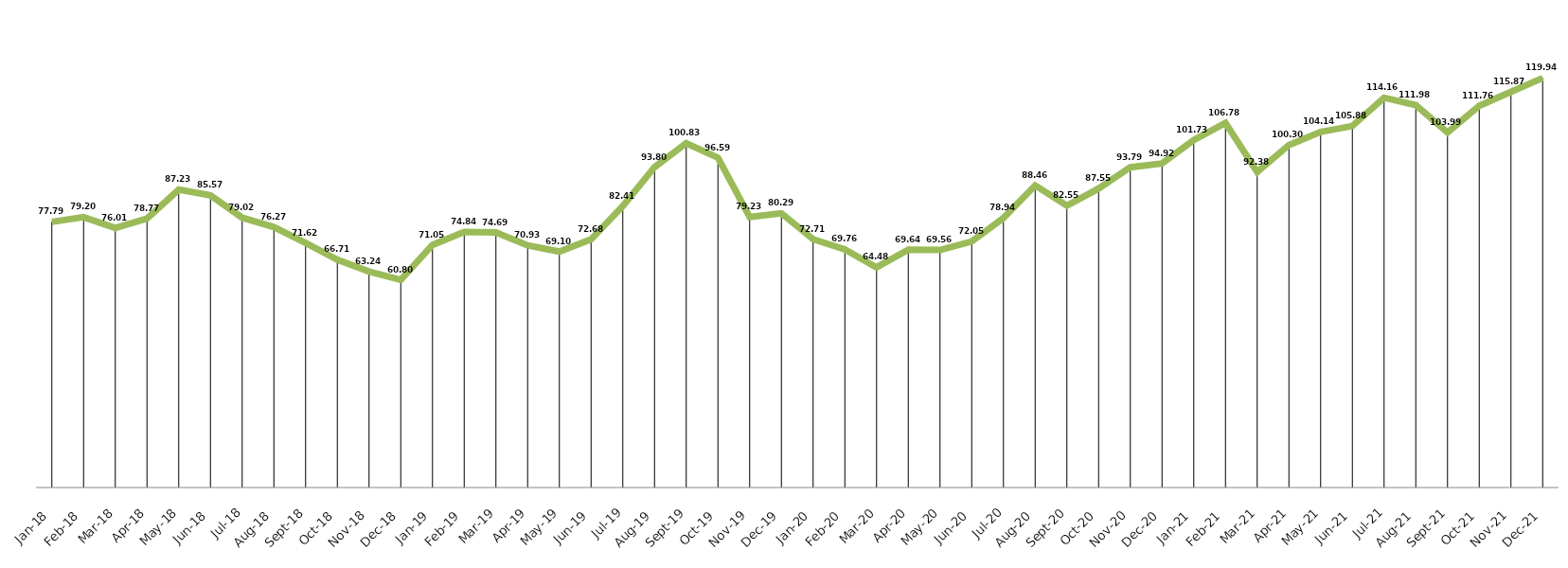
| Category | Series 0 |
|---|---|
| 2018-01-31 | 77.791 |
| 2018-02-28 | 79.197 |
| 2018-03-31 | 76.011 |
| 2018-04-30 | 78.766 |
| 2018-05-31 | 87.231 |
| 2018-06-30 | 85.567 |
| 2018-07-31 | 79.024 |
| 2018-08-31 | 76.27 |
| 2018-09-30 | 71.621 |
| 2018-10-31 | 66.714 |
| 2018-11-30 | 63.242 |
| 2018-12-31 | 60.803 |
| 2019-01-31 | 71.047 |
| 2019-02-28 | 74.835 |
| 2019-03-31 | 74.692 |
| 2019-04-30 | 70.933 |
| 2019-05-31 | 69.096 |
| 2019-06-30 | 72.683 |
| 2019-07-31 | 82.41 |
| 2019-08-31 | 93.802 |
| 2019-09-30 | 100.832 |
| 2019-10-31 | 96.585 |
| 2019-11-30 | 79.225 |
| 2019-12-31 | 80.287 |
| 2020-01-31 | 72.712 |
| 2020-02-29 | 69.756 |
| 2020-03-31 | 64.476 |
| 2020-04-30 | 69.636 |
| 2020-05-31 | 69.555 |
| 2020-06-30 | 72.052 |
| 2020-07-31 | 78.944 |
| 2020-08-31 | 88.459 |
| 2020-09-30 | 82.554 |
| 2020-10-31 | 87.552 |
| 2020-11-30 | 93.791 |
| 2020-12-31 | 94.921 |
| 2021-01-31 | 101.733 |
| 2021-02-28 | 106.783 |
| 2021-03-31 | 92.385 |
| 2021-04-30 | 100.298 |
| 2021-05-31 | 104.143 |
| 2021-06-30 | 105.882 |
| 2021-07-31 | 114.158 |
| 2021-08-31 | 111.983 |
| 2021-09-30 | 103.989 |
| 2021-10-31 | 111.765 |
| 2021-11-30 | 115.868 |
| 2021-12-31 | 119.943 |